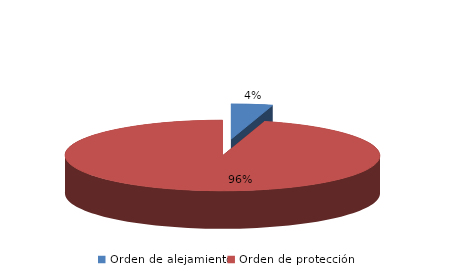
| Category | Series 0 |
|---|---|
| Orden de alejamiento | 18 |
| Orden de protección | 405 |